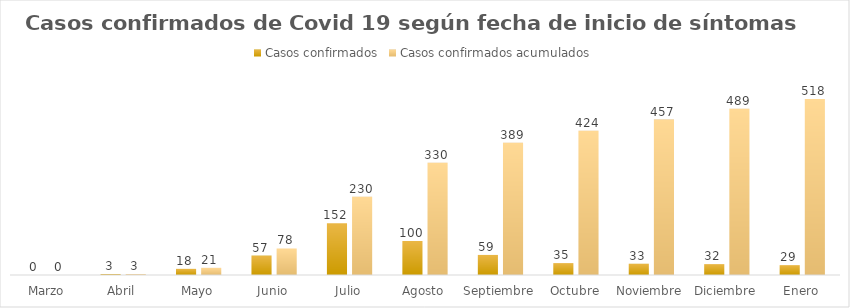
| Category | Casos confirmados | Casos confirmados acumulados |
|---|---|---|
| Marzo | 0 | 0 |
| Abril | 3 | 3 |
| Mayo | 18 | 21 |
| Junio | 57 | 78 |
| Julio | 152 | 230 |
| Agosto | 100 | 330 |
| Septiembre  | 59 | 389 |
| Octubre | 35 | 424 |
| Noviembre | 33 | 457 |
| Diciembre | 32 | 489 |
| Enero | 29 | 518 |